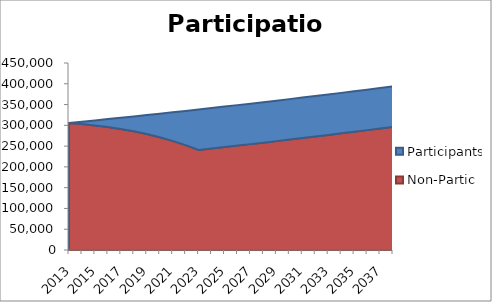
| Category | Non-Partic | Participants |
|---|---|---|
| 2013.0 | 305540 | 0 |
| 2014.0 | 302942.508 | 5714 |
| 2015.0 | 299725.408 | 12079.396 |
| 2016.0 | 295814.766 | 19170.447 |
| 2017.0 | 291128.184 | 27069.878 |
| 2018.0 | 285573.839 | 35869.844 |
| 2019.0 | 279049.402 | 45673.006 |
| 2020.0 | 271440.848 | 56593.729 |
| 2021.0 | 262621.115 | 68759.414 |
| 2022.0 | 252448.623 | 82311.988 |
| 2023.0 | 240765.615 | 97409.554 |
| 2024.0 | 244215.002 | 97409.554 |
| 2025.0 | 247699.572 | 97409.554 |
| 2026.0 | 251219.685 | 97409.554 |
| 2027.0 | 254775.704 | 97409.554 |
| 2028.0 | 258367.993 | 97409.554 |
| 2029.0 | 261996.924 | 97409.554 |
| 2030.0 | 265662.87 | 97409.554 |
| 2031.0 | 269366.209 | 97409.554 |
| 2032.0 | 273107.322 | 97409.554 |
| 2033.0 | 276886.594 | 97409.554 |
| 2034.0 | 280704.415 | 97409.554 |
| 2035.0 | 284561.177 | 97409.554 |
| 2036.0 | 288457.279 | 97409.554 |
| 2037.0 | 292393.12 | 97409.554 |
| 2038.0 | 296369.108 | 97409.554 |